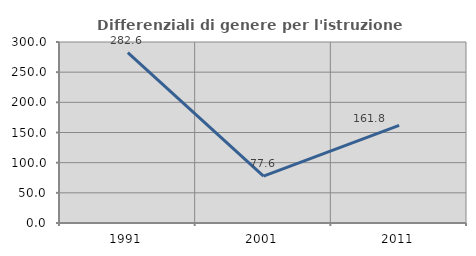
| Category | Differenziali di genere per l'istruzione superiore |
|---|---|
| 1991.0 | 282.569 |
| 2001.0 | 77.565 |
| 2011.0 | 161.844 |